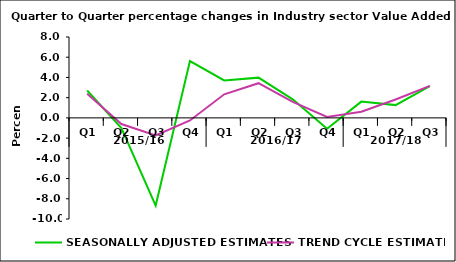
| Category | SEASONALLY ADJUSTED ESTIMATES | TREND CYCLE ESTIMATES |
|---|---|---|
| 0 | 2.71 | 2.391 |
| 1 | -1.011 | -0.607 |
| 2 | -8.671 | -1.743 |
| 3 | 5.626 | -0.253 |
| 4 | 3.7 | 2.333 |
| 5 | 3.98 | 3.431 |
| 6 | 1.838 | 1.575 |
| 7 | -1.066 | 0.085 |
| 8 | 1.61 | 0.604 |
| 9 | 1.264 | 1.816 |
| 10 | 3.137 | 3.169 |